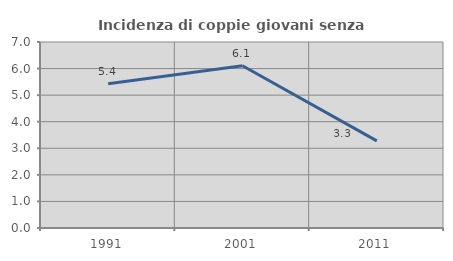
| Category | Incidenza di coppie giovani senza figli |
|---|---|
| 1991.0 | 5.43 |
| 2001.0 | 6.107 |
| 2011.0 | 3.279 |